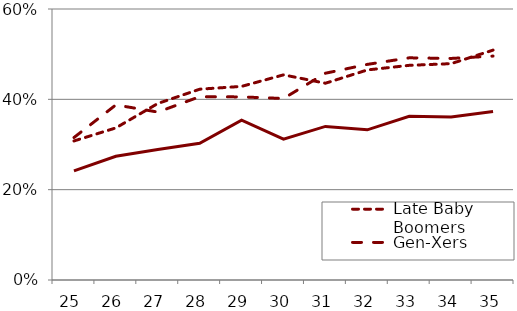
| Category | Late Baby Boomers | Gen-Xers | Millennials |
|---|---|---|---|
| 25.0 | 0.308 | 0.315 | 0.241 |
| 26.0 | 0.337 | 0.388 | 0.274 |
| 27.0 | 0.391 | 0.372 | 0.289 |
| 28.0 | 0.422 | 0.406 | 0.303 |
| 29.0 | 0.429 | 0.405 | 0.354 |
| 30.0 | 0.454 | 0.402 | 0.312 |
| 31.0 | 0.436 | 0.458 | 0.34 |
| 32.0 | 0.465 | 0.477 | 0.332 |
| 33.0 | 0.475 | 0.492 | 0.362 |
| 34.0 | 0.479 | 0.491 | 0.361 |
| 35.0 | 0.509 | 0.496 | 0.373 |